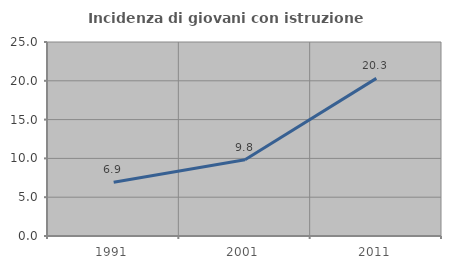
| Category | Incidenza di giovani con istruzione universitaria |
|---|---|
| 1991.0 | 6.938 |
| 2001.0 | 9.836 |
| 2011.0 | 20.312 |